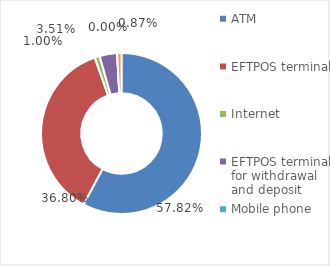
| Category | Value of transactions, in HRK |
|---|---|
| ATM | 81058995369 |
| EFTPOS terminal | 51588697006 |
| Internet | 1406614609 |
| EFTPOS terminal for withdrawal and deposit | 4925973326 |
| Mobile phone | 3362213 |
| Other | 1214891395 |